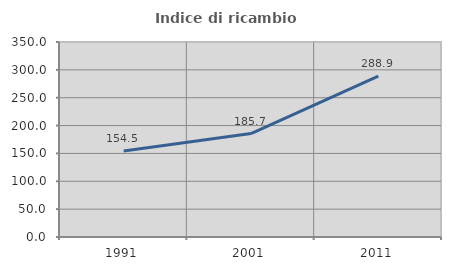
| Category | Indice di ricambio occupazionale  |
|---|---|
| 1991.0 | 154.545 |
| 2001.0 | 185.714 |
| 2011.0 | 288.889 |